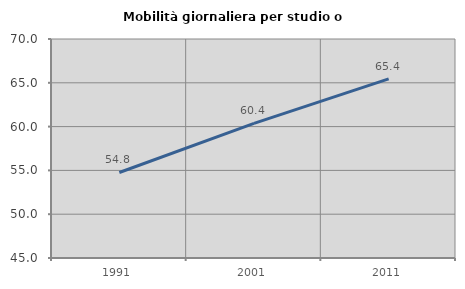
| Category | Mobilità giornaliera per studio o lavoro |
|---|---|
| 1991.0 | 54.762 |
| 2001.0 | 60.37 |
| 2011.0 | 65.443 |